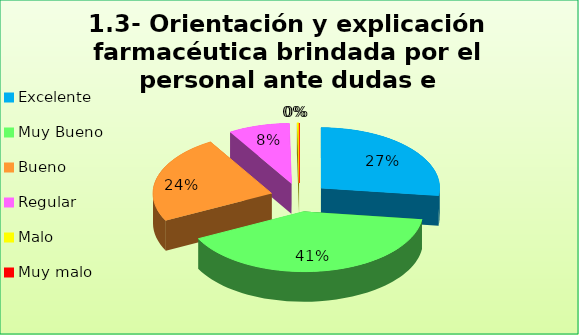
| Category | Series 0 |
|---|---|
| Excelente | 0.27 |
| Muy Bueno | 0.405 |
| Bueno  | 0.239 |
| Regular  | 0.083 |
| Malo  | 0.003 |
| Muy malo  | 0 |